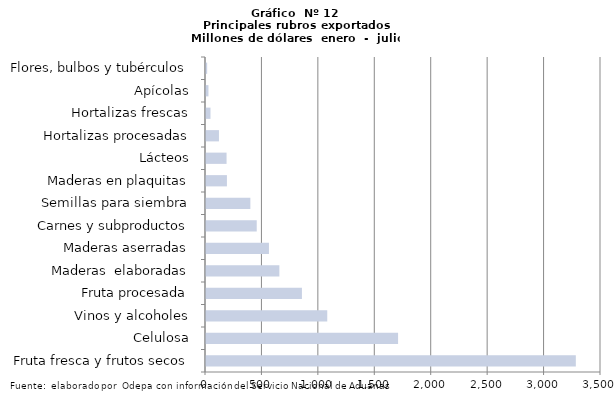
| Category | Series 7 |
|---|---|
| Fruta fresca y frutos secos | 3276966.919 |
| Celulosa | 1701879.971 |
| Vinos y alcoholes | 1074299.233 |
| Fruta procesada | 850024.395 |
| Maderas  elaboradas | 650090.369 |
| Maderas aserradas | 557721.68 |
| Carnes y subproductos | 449539.19 |
| Semillas para siembra | 393004.01 |
| Maderas en plaquitas | 185418.879 |
| Lácteos | 182226.187 |
| Hortalizas procesadas | 114819.204 |
| Hortalizas frescas | 39715.843 |
| Apícolas | 21731.274 |
| Flores, bulbos y tubérculos | 10291.62 |